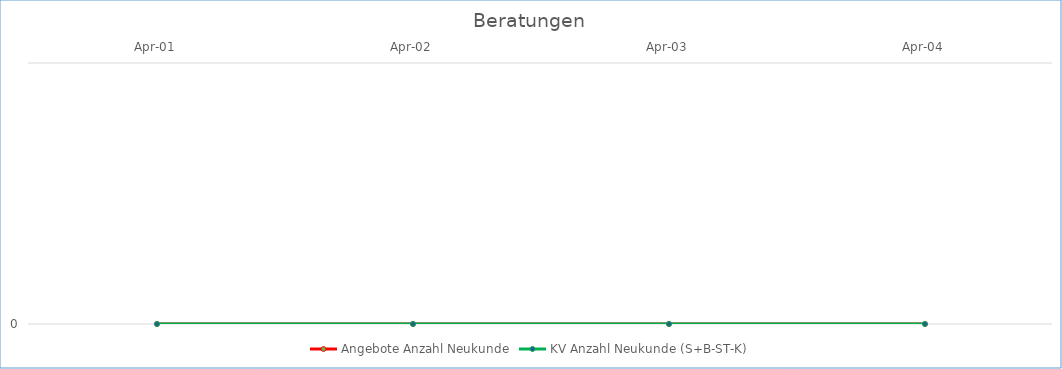
| Category | Angebote Anzahl Neukunde | KV Anzahl Neukunde (S+B-ST-K) |
|---|---|---|
| 2001-04-01 | 0 | 0 |
| 2002-04-01 | 0 | 0 |
| 2003-04-01 | 0 | 0 |
| 2004-04-01 | 0 | 0 |